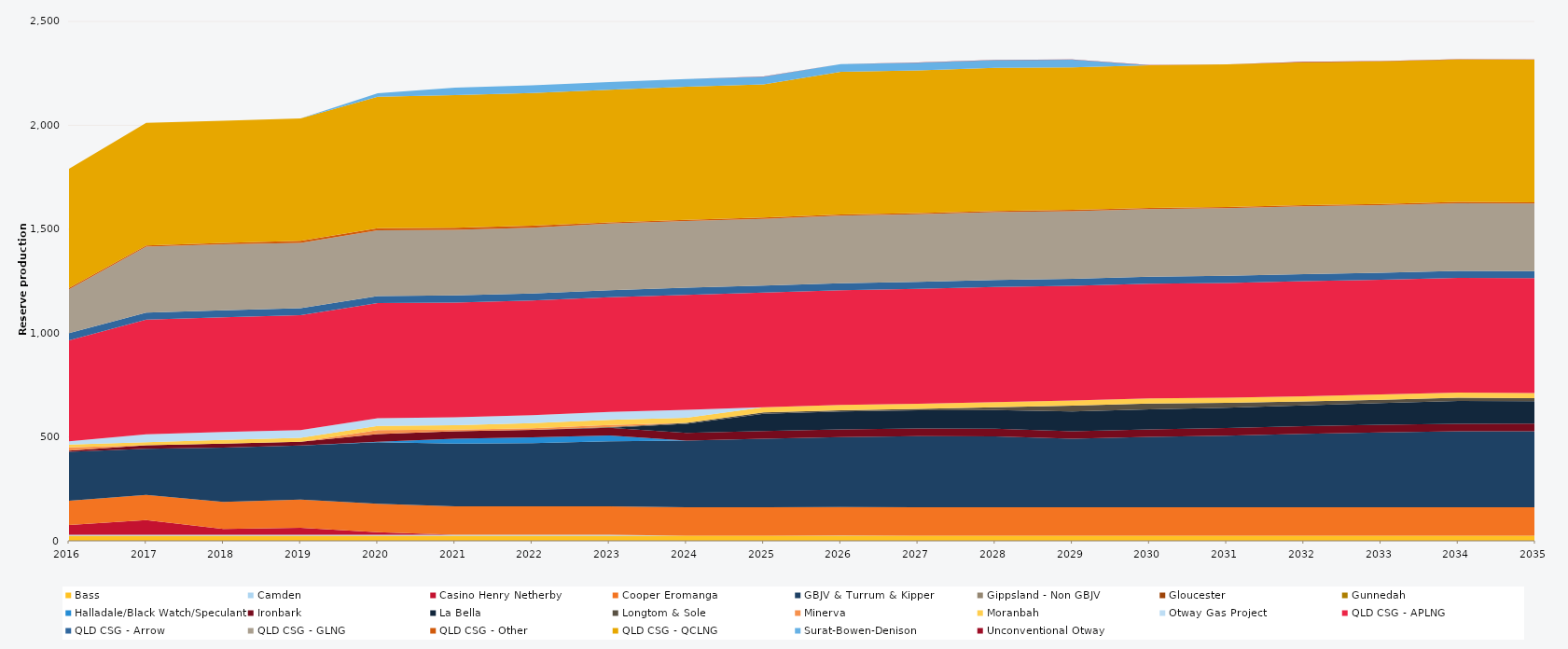
| Category | Bass | Camden | Casino Henry Netherby | Cooper Eromanga | GBJV & Turrum & Kipper | Gippsland - Non GBJV | Gloucester | Gunnedah | Halladale/Black Watch/Speculant | Ironbark | La Bella | Longtom & Sole | Minerva | Moranbah | Otway Gas Project | QLD CSG - APLNG | QLD CSG - Arrow | QLD CSG - GLNG | QLD CSG - Other | QLD CSG - QCLNG | Surat-Bowen-Denison | Unconventional Otway |
|---|---|---|---|---|---|---|---|---|---|---|---|---|---|---|---|---|---|---|---|---|---|---|
| 2016 | 24.522 | 5 | 46.799 | 117.222 | 235.041 | 0 | 0 | 0 | 0 | 5.693 | 0 | 0 | 16 | 13.152 | 15.606 | 486.488 | 34.038 | 211.509 | 5.856 | 573.724 | 0 | 0 |
| 2017 | 24.455 | 5 | 70.439 | 121.164 | 222.562 | 0 | 0 | 0 | 0 | 16.208 | 0 | 0 | 0 | 14.795 | 38 | 552.245 | 33.945 | 317.487 | 5.84 | 589.555 | 0 | 0 |
| 2018 | 24.455 | 5 | 27.379 | 130.69 | 261.823 | 0 | 0 | 0 | 0 | 18.199 | 0 | 0 | 0 | 17.982 | 38 | 552.245 | 33.945 | 318.05 | 5.84 | 588.729 | 0 | 0 |
| 2019 | 24.455 | 5 | 33.563 | 135.337 | 260.814 | 0 | 0 | 0 | 0 | 18.25 | 0 | 0 | 0 | 18.049 | 38 | 552.245 | 33.945 | 314.41 | 10.403 | 588.925 | 0 | 0 |
| 2020 | 24.522 | 5 | 12.08 | 137.25 | 295.556 | 0 | 0 | 0 | 2.407 | 36.6 | 0 | 0 | 19.609 | 19.619 | 38 | 553.758 | 34.038 | 315.78 | 10.419 | 633.431 | 16.511 | 0 |
| 2021 | 24.455 | 5 | 0 | 136.875 | 301.268 | 0 | 0 | 0 | 23.407 | 36.5 | 0 | 0 | 7.191 | 22.179 | 38 | 552.245 | 33.945 | 315.979 | 10.403 | 638.353 | 35.106 | 0 |
| 2022 | 24.455 | 5 | 0 | 136.875 | 303.647 | 0 | 0 | 0 | 27.811 | 36.5 | 0 | 0 | 7.872 | 24.141 | 38 | 552.245 | 33.945 | 316.423 | 10.403 | 638.37 | 37.23 | 0 |
| 2023 | 24.455 | 5 | 0 | 136.875 | 312.649 | 0 | 0 | 0 | 28.376 | 36.5 | 0 | 3.645 | 10.079 | 24.787 | 38 | 552.245 | 33.945 | 320.755 | 5.84 | 638.027 | 37.23 | 0 |
| 2024 | 24.522 | 0 | 0 | 137.25 | 320.648 | 0 | 0 | 0 | 0 | 36.6 | 44.609 | 4.054 | 0 | 24.888 | 38 | 553.758 | 34.038 | 321.248 | 5.856 | 639.799 | 37.332 | 0 |
| 2025 | 24.455 | 0 | 0 | 136.875 | 330.375 | 0 | 0 | 0 | 0 | 36.5 | 83.83 | 6.025 | 0 | 24.82 | 0 | 552.245 | 33.945 | 320.874 | 5.84 | 641.111 | 37.23 | 1.495 |
| 2026 | 24.455 | 1 | 0 | 136.875 | 337.029 | 0 | 0 | 0 | 0 | 36.5 | 86.924 | 6.043 | 0 | 24.82 | 0 | 552.245 | 33.945 | 325.58 | 5.84 | 686.2 | 37.23 | 0.346 |
| 2027 | 24.455 | 0 | 0 | 136.875 | 342.614 | 0 | 0 | 0 | 0 | 36.5 | 88.317 | 6.652 | 0 | 24.82 | 0 | 552.245 | 33.945 | 325.58 | 5.84 | 686.2 | 37.23 | 1.418 |
| 2028 | 24.522 | 0 | 0 | 137.25 | 340.795 | 0 | 0 | 0 | 0 | 36.6 | 90.155 | 13.798 | 0 | 24.888 | 0 | 553.758 | 34.038 | 326.472 | 5.856 | 688.08 | 37.332 | 0.959 |
| 2029 | 24.455 | 0 | 0 | 136.875 | 329.882 | 0 | 0 | 0 | 0 | 36.5 | 95.444 | 27.375 | 0 | 24.82 | 0 | 552.245 | 33.945 | 325.58 | 5.84 | 686.2 | 37.083 | 0.319 |
| 2030 | 24.455 | 0 | 0 | 136.875 | 338.656 | 0 | 0 | 0 | 0 | 36.5 | 96.556 | 27.375 | 0 | 24.82 | 0 | 552.245 | 33.945 | 325.58 | 5.84 | 686.2 | 0 | 0.85 |
| 2031 | 24.455 | 0 | 0 | 136.875 | 345.041 | 0 | 0 | 0 | 0 | 36.5 | 98.269 | 23.302 | 0 | 24.82 | 0 | 552.245 | 33.945 | 325.58 | 5.84 | 686.2 | 0 | 0.769 |
| 2032 | 24.522 | 0 | 0 | 137.25 | 353.221 | 0 | 0 | 0 | 0 | 36.6 | 100.242 | 19.261 | 0 | 24.888 | 0 | 553.758 | 34.038 | 326.472 | 5.856 | 688.08 | 0 | 1.337 |
| 2033 | 24.455 | 0 | 0 | 136.875 | 360.471 | 0 | 0 | 0 | 0 | 36.5 | 105.351 | 15.707 | 0 | 24.82 | 0 | 552.245 | 33.945 | 325.58 | 5.84 | 686.2 | 0 | 0.805 |
| 2034 | 24.455 | 0 | 0 | 136.875 | 365.789 | 0 | 0 | 0 | 0 | 36.5 | 109.264 | 15.711 | 0 | 24.82 | 0 | 552.245 | 33.945 | 325.58 | 5.84 | 686.2 | 0 | 1.477 |
| 2035 | 24.455 | 0 | 0 | 136.875 | 366.262 | 0 | 0 | 0 | 0 | 36.5 | 108.04 | 14.877 | 0 | 24.82 | 0 | 552.245 | 33.945 | 325.58 | 5.84 | 686.2 | 0 | 1.224 |